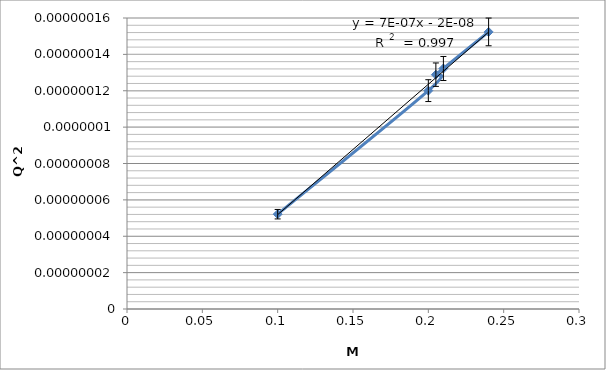
| Category | Series 0 |
|---|---|
| 0.1 | 0 |
| 0.2 | 0 |
| 0.205 | 0 |
| 0.21 | 0 |
| 0.24 | 0 |